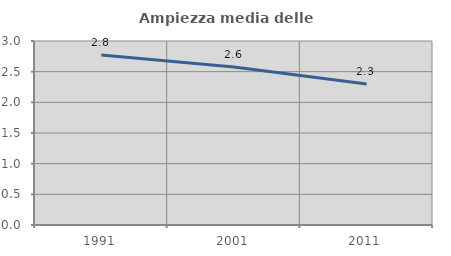
| Category | Ampiezza media delle famiglie |
|---|---|
| 1991.0 | 2.774 |
| 2001.0 | 2.578 |
| 2011.0 | 2.301 |